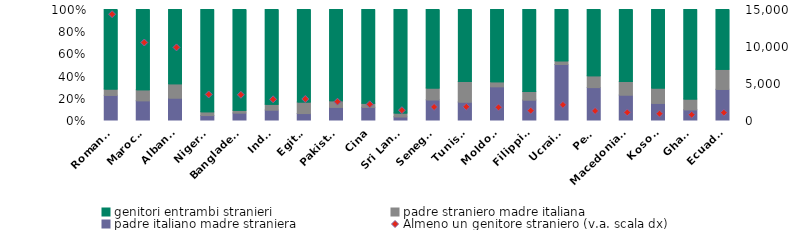
| Category | padre italiano madre straniera | padre straniero madre italiana | genitori entrambi stranieri |
|---|---|---|---|
| Romania | 3282 | 824 | 10329 |
| Marocco | 1895 | 1048 | 7664 |
| Albania | 2020 | 1264 | 6660 |
| Nigeria | 159 | 127 | 3302 |
| Bangladesh | 242 | 81 | 3216 |
| India | 278 | 152 | 2501 |
| Egitto | 186 | 310 | 2477 |
| Pakistan | 311 | 152 | 2143 |
| Cina | 270 | 81 | 1902 |
| Sri Lanka | 48 | 51 | 1366 |
| Senegal | 353 | 203 | 1342 |
| Tunisia | 320 | 353 | 1247 |
| Moldova | 562 | 82 | 1199 |
| Filippine | 259 | 108 | 1033 |
| Ucraina | 1100 | 72 | 1009 |
| Perù | 403 | 145 | 812 |
| Macedonia del Nord | 266 | 140 | 750 |
| Kosovo | 153 | 135 | 699 |
| Ghana | 82 | 82 | 686 |
| Ecuador | 315 | 203 | 605 |